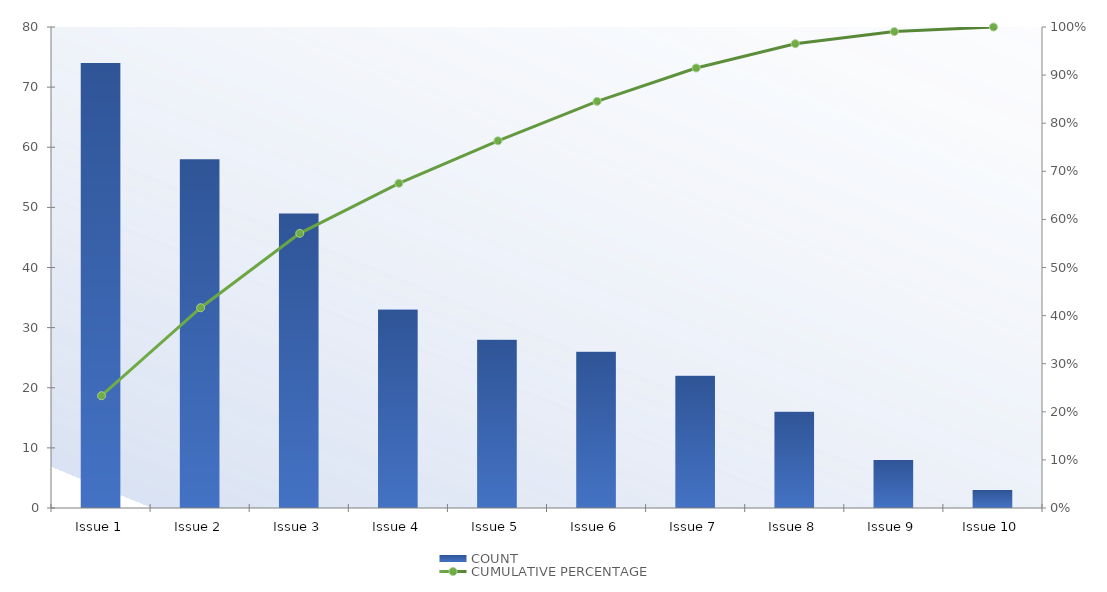
| Category | COUNT |
|---|---|
| Issue 1 | 74 |
| Issue 2 | 58 |
| Issue 3 | 49 |
| Issue 4 | 33 |
| Issue 5 | 28 |
| Issue 6 | 26 |
| Issue 7 | 22 |
| Issue 8 | 16 |
| Issue 9 | 8 |
| Issue 10 | 3 |